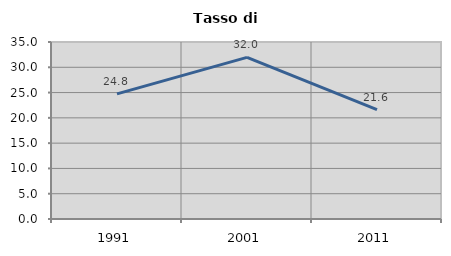
| Category | Tasso di disoccupazione   |
|---|---|
| 1991.0 | 24.752 |
| 2001.0 | 31.967 |
| 2011.0 | 21.622 |